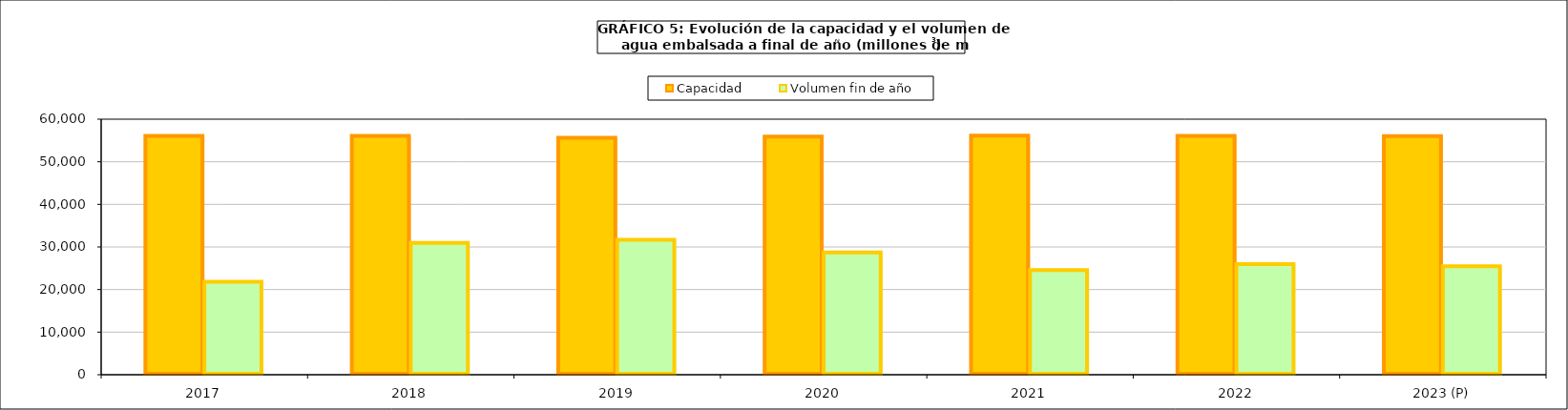
| Category | Capacidad | Volumen fin de año |
|---|---|---|
| 2017 | 56074 | 21832 |
| 2018 | 56074 | 30936 |
| 2019 | 55622 | 31678 |
| 2020 | 55899 | 28692 |
| 2021 | 56136 | 24545 |
| 2022 | 56069 | 25977 |
| 2023 (P) | 56039 | 25474 |